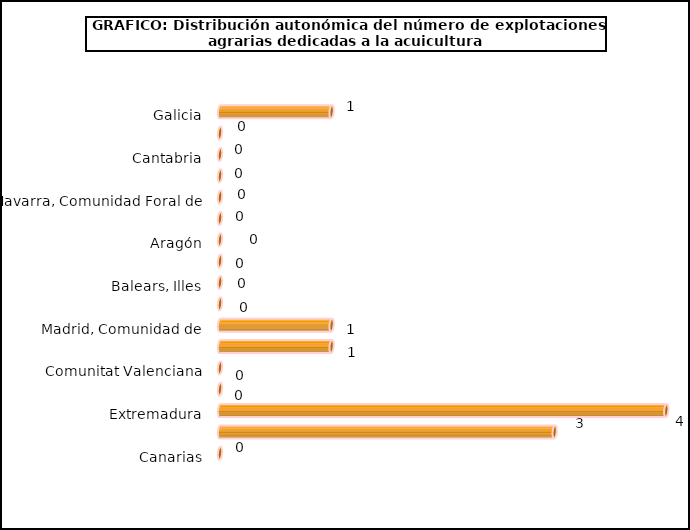
| Category | num. Explotaciones |
|---|---|
| Galicia | 1 |
| Asturias, Principado de | 0 |
| Cantabria | 0 |
| País Vasco | 0 |
| Navarra, Comunidad Foral de | 0 |
| Rioja, La | 0 |
| Aragón | 0 |
| Cataluña | 0 |
| Balears, Illes | 0 |
| Castilla y León | 0 |
| Madrid, Comunidad de | 1 |
| Castilla - La Mancha | 1 |
| Comunitat Valenciana | 0 |
| Murcia, Región de | 0 |
| Extremadura | 4 |
| Andalucía | 3 |
| Canarias | 0 |